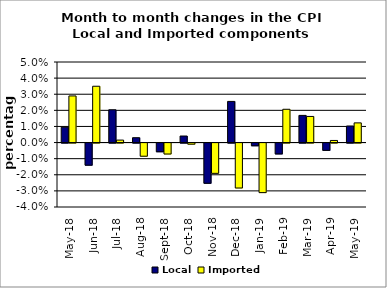
| Category | Local | Imported |
|---|---|---|
| 2018-05-01 | 0.01 | 0.029 |
| 2018-06-01 | -0.014 | 0.035 |
| 2018-07-01 | 0.02 | 0.002 |
| 2018-08-01 | 0.003 | -0.008 |
| 2018-09-01 | -0.005 | -0.007 |
| 2018-10-01 | 0.004 | -0.001 |
| 2018-11-01 | -0.025 | -0.019 |
| 2018-12-01 | 0.026 | -0.028 |
| 2019-01-01 | -0.002 | -0.031 |
| 2019-02-01 | -0.007 | 0.021 |
| 2019-03-01 | 0.017 | 0.016 |
| 2019-04-01 | -0.005 | 0.001 |
| 2019-05-01 | 0.01 | 0.012 |